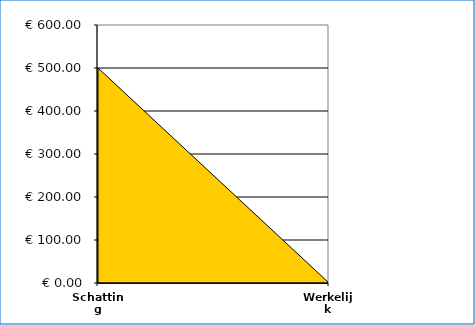
| Category | Totale inkomsten | Totale uitgaven |
|---|---|---|
| Schatting | 0 | 500 |
| Werkelijk | 0 | 0 |